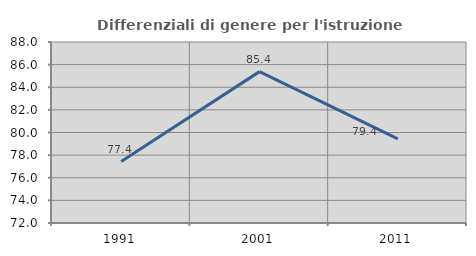
| Category | Differenziali di genere per l'istruzione superiore |
|---|---|
| 1991.0 | 77.429 |
| 2001.0 | 85.382 |
| 2011.0 | 79.429 |